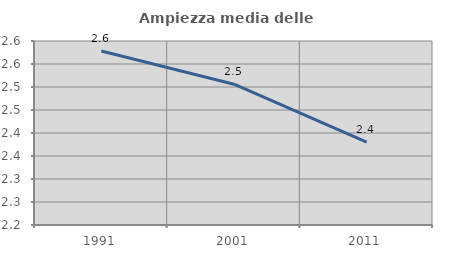
| Category | Ampiezza media delle famiglie |
|---|---|
| 1991.0 | 2.578 |
| 2001.0 | 2.506 |
| 2011.0 | 2.38 |